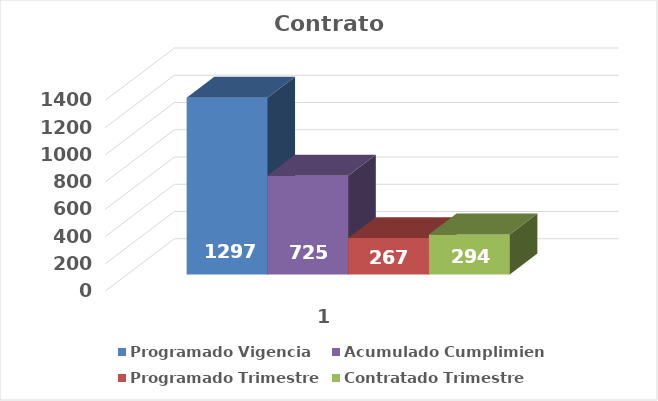
| Category | Programado Vigencia | Acumulado Cumplimiento | Programado Trimestre | Contratado Trimestre |
|---|---|---|---|---|
| 0 | 1297 | 725 | 267 | 294 |